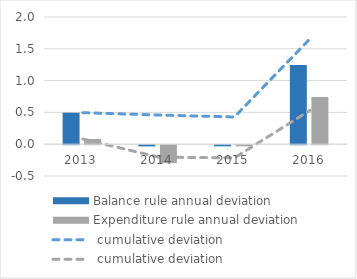
| Category | Balance rule annual deviation | Expenditure rule annual deviation |
|---|---|---|
| 2013.0 | 0.495 | 0.081 |
| 2014.0 | -0.019 | -0.282 |
| 2015.0 | -0.017 | -0.018 |
| 2016.0 | 1.243 | 0.743 |